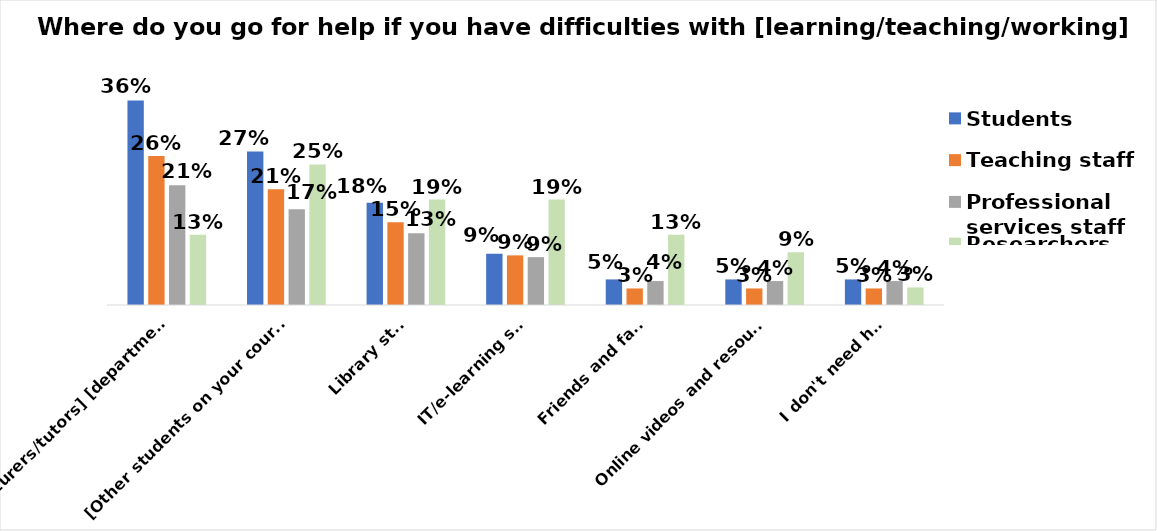
| Category | Students | Teaching staff | Professional services staff | Researchers |
|---|---|---|---|---|
| [Lecturers/tutors] [department/team leader] [research lead or supervisor] | 0.364 | 0.265 | 0.213 | 0.125 |
| [Other students on your course] [colleagues] | 0.273 | 0.206 | 0.17 | 0.25 |
| Library staff | 0.182 | 0.147 | 0.128 | 0.188 |
| IT/e-learning staff | 0.091 | 0.088 | 0.085 | 0.188 |
| Friends and family | 0.045 | 0.029 | 0.043 | 0.125 |
| Online videos and resources | 0.045 | 0.029 | 0.043 | 0.094 |
| I don't need help | 0.045 | 0.029 | 0.043 | 0.031 |